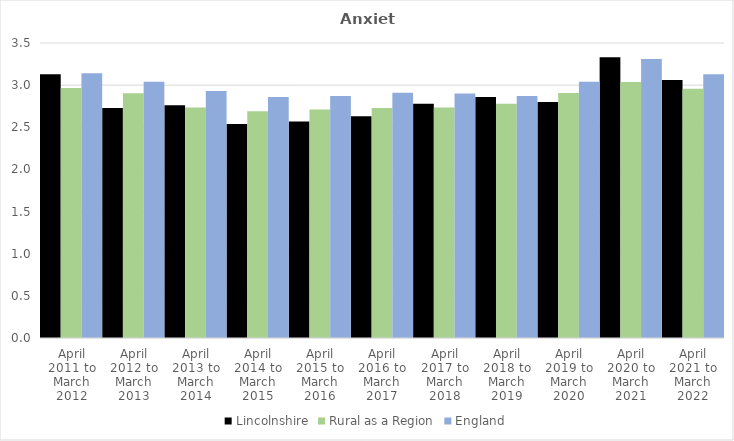
| Category | Lincolnshire | Rural as a Region | England |
|---|---|---|---|
| April 2011 to March 2012 | 3.13 | 2.967 | 3.14 |
| April 2012 to March 2013 | 2.73 | 2.904 | 3.04 |
| April 2013 to March 2014 | 2.76 | 2.734 | 2.93 |
| April 2014 to March 2015 | 2.54 | 2.691 | 2.86 |
| April 2015 to March 2016 | 2.57 | 2.711 | 2.87 |
| April 2016 to March 2017 | 2.63 | 2.729 | 2.91 |
| April 2017 to March 2018 | 2.78 | 2.736 | 2.9 |
| April 2018 to March 2019 | 2.86 | 2.78 | 2.87 |
| April 2019 to March 2020 | 2.8 | 2.908 | 3.04 |
| April 2020 to March 2021 | 3.33 | 3.036 | 3.31 |
| April 2021 to March 2022 | 3.06 | 2.956 | 3.13 |